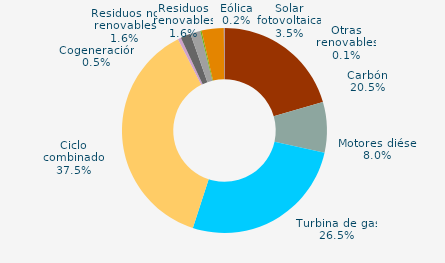
| Category | Series 0 |
|---|---|
| Carbón | 20.5 |
| Motores diésel | 8 |
| Turbina de gas | 26.5 |
| Ciclo combinado | 37.5 |
| Generación auxiliar | 0 |
| Cogeneración | 0.5 |
| Residuos no renovables | 1.6 |
| Residuos renovables | 1.6 |
| Eólica | 0.2 |
| Solar fotovoltaica | 3.5 |
| Otras renovables | 0.1 |